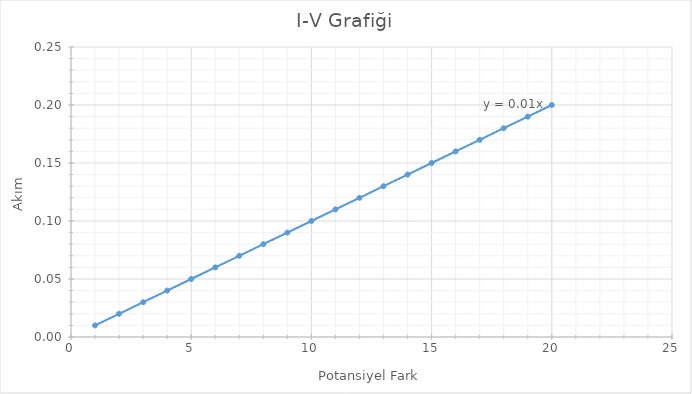
| Category | Series 0 |
|---|---|
| 1.0 | 0.01 |
| 2.0 | 0.02 |
| 3.0 | 0.03 |
| 4.0 | 0.04 |
| 5.0 | 0.05 |
| 6.0 | 0.06 |
| 7.0 | 0.07 |
| 8.0 | 0.08 |
| 9.0 | 0.09 |
| 10.0 | 0.1 |
| 11.0 | 0.11 |
| 12.0 | 0.12 |
| 13.0 | 0.13 |
| 14.0 | 0.14 |
| 15.0 | 0.15 |
| 16.0 | 0.16 |
| 17.0 | 0.17 |
| 18.0 | 0.18 |
| 19.0 | 0.19 |
| 20.0 | 0.2 |